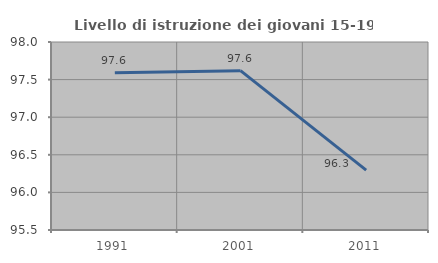
| Category | Livello di istruzione dei giovani 15-19 anni |
|---|---|
| 1991.0 | 97.59 |
| 2001.0 | 97.619 |
| 2011.0 | 96.296 |